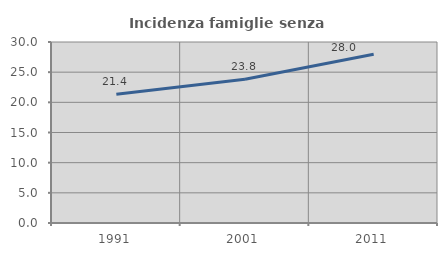
| Category | Incidenza famiglie senza nuclei |
|---|---|
| 1991.0 | 21.35 |
| 2001.0 | 23.819 |
| 2011.0 | 27.97 |